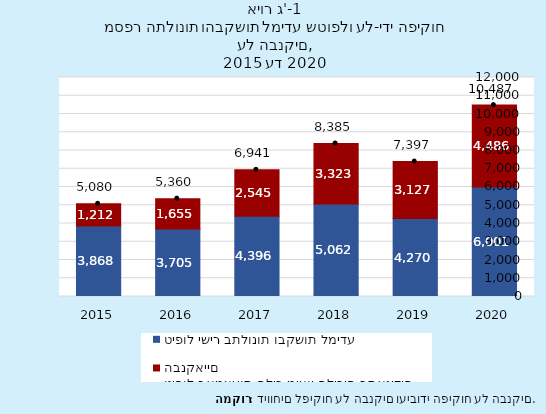
| Category | טיפול ישיר בתלונות ובקשות למידע | טיפול באמצעות הליך מיצוי הליכים בתאגידים הבנקאיים |
|---|---|---|
| 2020.0 | 6001 | 4486 |
| 2019.0 | 4270 | 3127 |
| 2018.0 | 5062 | 3323 |
| 2017.0 | 4396 | 2545 |
| 2016.0 | 3705 | 1655 |
| 2015.0 | 3868 | 1212 |